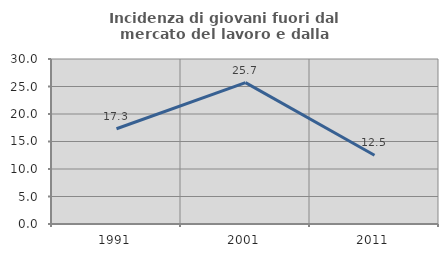
| Category | Incidenza di giovani fuori dal mercato del lavoro e dalla formazione  |
|---|---|
| 1991.0 | 17.316 |
| 2001.0 | 25.707 |
| 2011.0 | 12.5 |